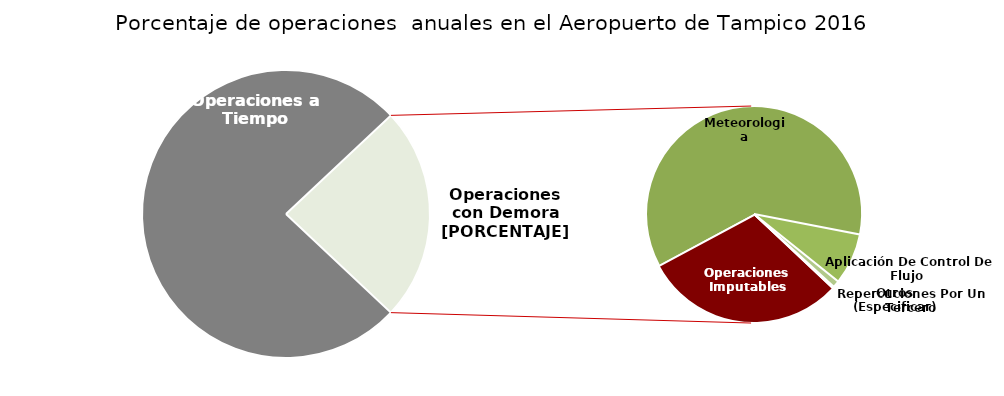
| Category | Series 0 |
|---|---|
| Operaciones a Tiempo | 6530 |
| Operaciones Imputables | 622 |
| Meteorologia | 1257 |
| Aplicación De Control De Flujo  | 159 |
| Repercuciones Por Un Tercero | 21 |
| Otros (Especificar) | 5 |
| Varios | 0 |